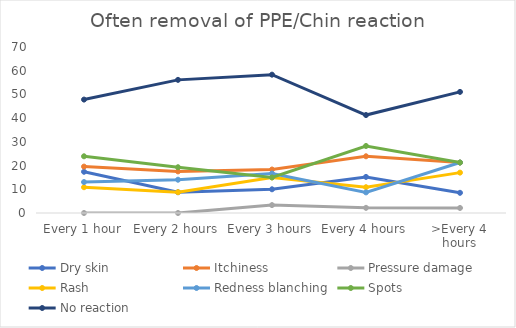
| Category | Dry skin | Itchiness | Pressure damage | Rash | Redness blanching | Spots | No reaction |
|---|---|---|---|---|---|---|---|
| Every 1 hour | 17.391 | 19.565 | 0 | 10.87 | 13.043 | 23.913 | 47.826 |
| Every 2 hours | 8.772 | 17.544 | 0 | 8.772 | 14.035 | 19.298 | 56.14 |
| Every 3 hours | 10 | 18.333 | 3.333 | 15 | 16.667 | 15 | 58.333 |
| Every 4 hours | 15.217 | 23.913 | 2.174 | 10.87 | 8.696 | 28.261 | 41.304 |
| >Every 4 hours | 8.511 | 21.277 | 2.128 | 17.021 | 21.277 | 21.277 | 51.064 |